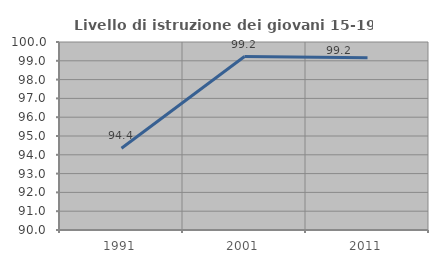
| Category | Livello di istruzione dei giovani 15-19 anni |
|---|---|
| 1991.0 | 94.35 |
| 2001.0 | 99.225 |
| 2011.0 | 99.16 |